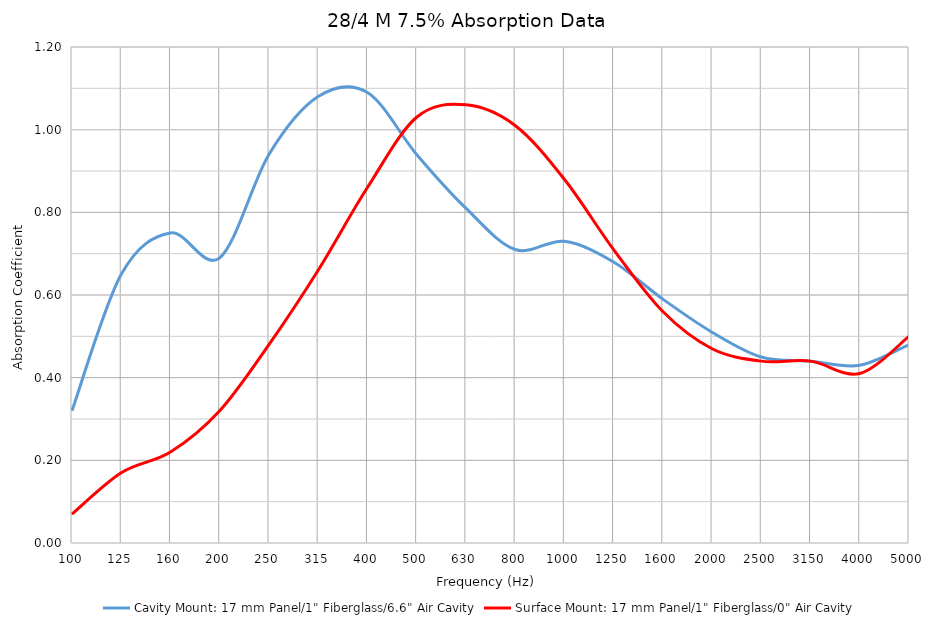
| Category | Cavity Mount: 17 mm Panel/1" Fiberglass/6.6" Air Cavity | Surface Mount: 17 mm Panel/1" Fiberglass/0" Air Cavity |
|---|---|---|
| 100.0 | 0.32 | 0.07 |
| 125.0 | 0.65 | 0.17 |
| 160.0 | 0.75 | 0.22 |
| 200.0 | 0.69 | 0.32 |
| 250.0 | 0.94 | 0.48 |
| 315.0 | 1.08 | 0.66 |
| 400.0 | 1.09 | 0.86 |
| 500.0 | 0.94 | 1.03 |
| 630.0 | 0.81 | 1.06 |
| 800.0 | 0.71 | 1.01 |
| 1000.0 | 0.73 | 0.88 |
| 1250.0 | 0.68 | 0.71 |
| 1600.0 | 0.59 | 0.56 |
| 2000.0 | 0.51 | 0.47 |
| 2500.0 | 0.45 | 0.44 |
| 3150.0 | 0.44 | 0.44 |
| 4000.0 | 0.43 | 0.41 |
| 5000.0 | 0.48 | 0.5 |